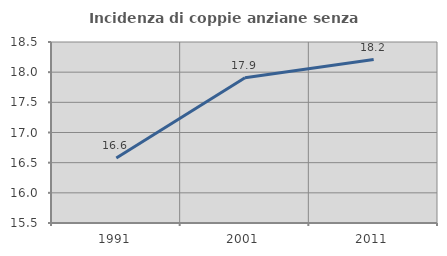
| Category | Incidenza di coppie anziane senza figli  |
|---|---|
| 1991.0 | 16.578 |
| 2001.0 | 17.907 |
| 2011.0 | 18.208 |